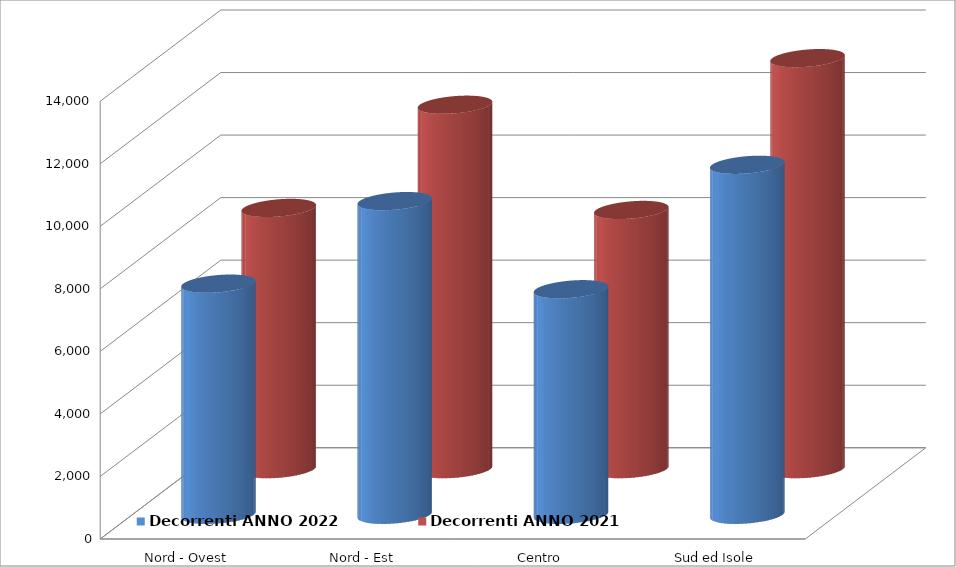
| Category | Decorrenti ANNO 2022 | Decorrenti ANNO 2021 |
|---|---|---|
| Nord - Ovest | 7393 | 8356 |
| Nord - Est | 10033 | 11656 |
| Centro | 7215 | 8291 |
| Sud ed Isole | 11194 | 13146 |